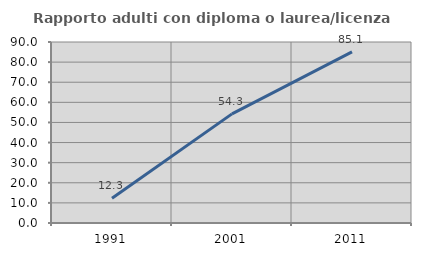
| Category | Rapporto adulti con diploma o laurea/licenza media  |
|---|---|
| 1991.0 | 12.281 |
| 2001.0 | 54.271 |
| 2011.0 | 85.075 |